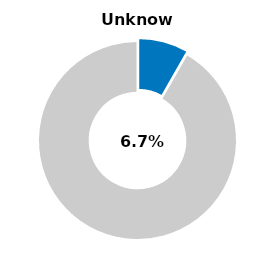
| Category | Series 0 |
|---|---|
| Unknown | 0.067 |
| Other | 0.744 |